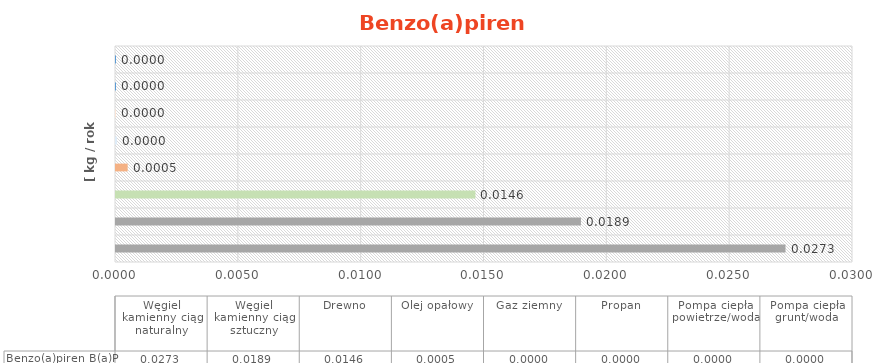
| Category | Benzo(a)piren |
|---|---|
| Węgiel kamienny ciąg naturalny | 0.027 |
| Węgiel kamienny ciąg sztuczny | 0.019 |
| Drewno | 0.015 |
| Olej opałowy | 0 |
| Gaz ziemny | 0 |
| Propan | 0 |
| Pompa ciepła powietrze/woda | 0 |
| Pompa ciepła grunt/woda | 0 |